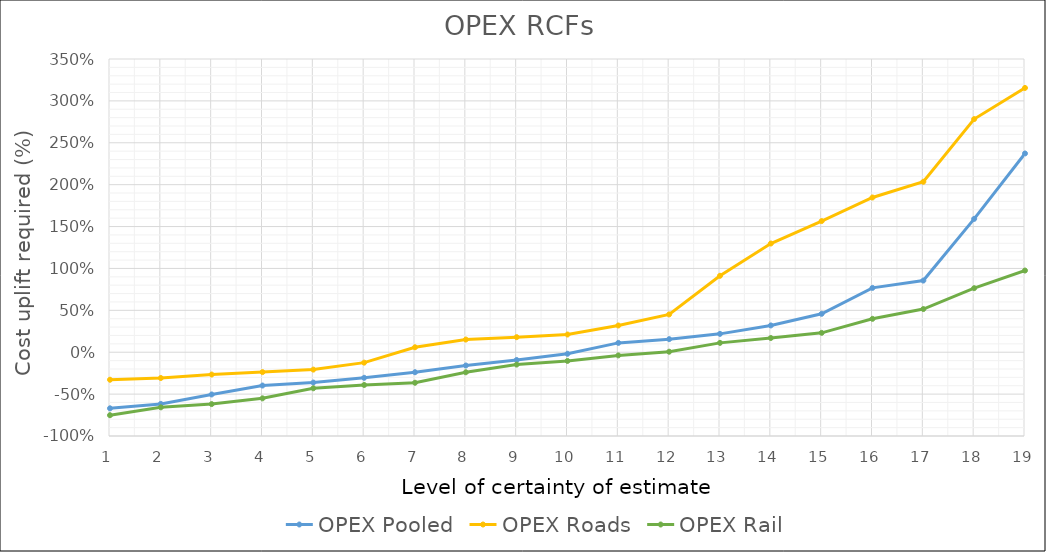
| Category | OPEX Pooled | OPEX Roads | OPEX Rail |
|---|---|---|---|
| 0 | -0.67 | -0.328 | -0.752 |
| 1 | -0.617 | -0.308 | -0.658 |
| 2 | -0.504 | -0.266 | -0.619 |
| 3 | -0.398 | -0.237 | -0.551 |
| 4 | -0.362 | -0.208 | -0.43 |
| 5 | -0.305 | -0.124 | -0.391 |
| 6 | -0.239 | 0.059 | -0.365 |
| 7 | -0.158 | 0.151 | -0.239 |
| 8 | -0.093 | 0.18 | -0.147 |
| 9 | -0.018 | 0.211 | -0.104 |
| 10 | 0.111 | 0.319 | -0.038 |
| 11 | 0.156 | 0.451 | 0.006 |
| 12 | 0.219 | 0.912 | 0.112 |
| 13 | 0.32 | 1.298 | 0.17 |
| 14 | 0.459 | 1.566 | 0.231 |
| 15 | 0.768 | 1.847 | 0.399 |
| 16 | 0.855 | 2.034 | 0.515 |
| 17 | 1.592 | 2.783 | 0.765 |
| 18 | 2.372 | 3.155 | 0.975 |